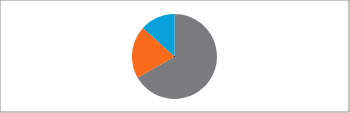
| Category | Effectifs 
n | Pourcentage
% |
|---|---|---|
| [ 30 - 35 [ | 10 | 0.571 |
| [ 35 - 40 [ | 3 | 0.286 |
| [ 40 - 45 [ | 2 | 0.143 |